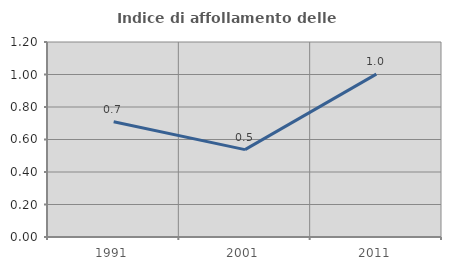
| Category | Indice di affollamento delle abitazioni  |
|---|---|
| 1991.0 | 0.709 |
| 2001.0 | 0.538 |
| 2011.0 | 1.002 |